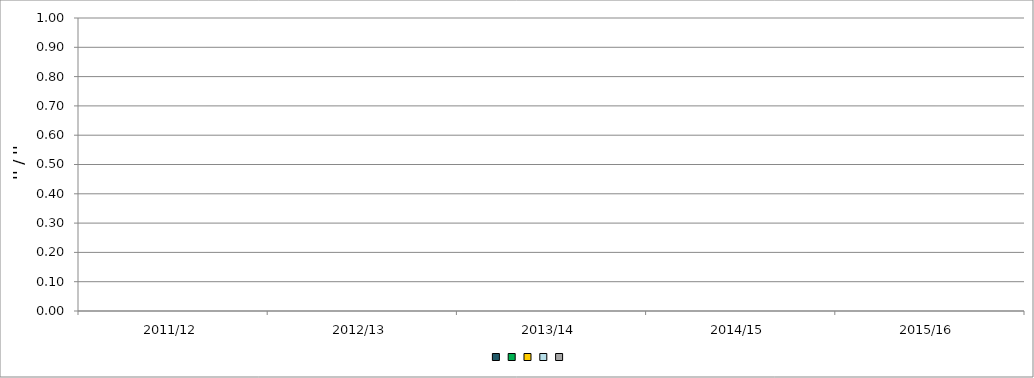
| Category | Series 0 | Series 1 | Series 2 | Series 3 | Series 4 |
|---|---|---|---|---|---|
| 2011/12 | 0 | 0 | 0 | 0 | 0 |
| 2012/13 | 0 | 0 | 0 | 0 | 0 |
| 2013/14 | 0 | 0 | 0 | 0 | 0 |
| 2014/15 | 0 | 0 | 0 | 0 | 0 |
| 2015/16 | 0 | 0 | 0 | 0 | 0 |